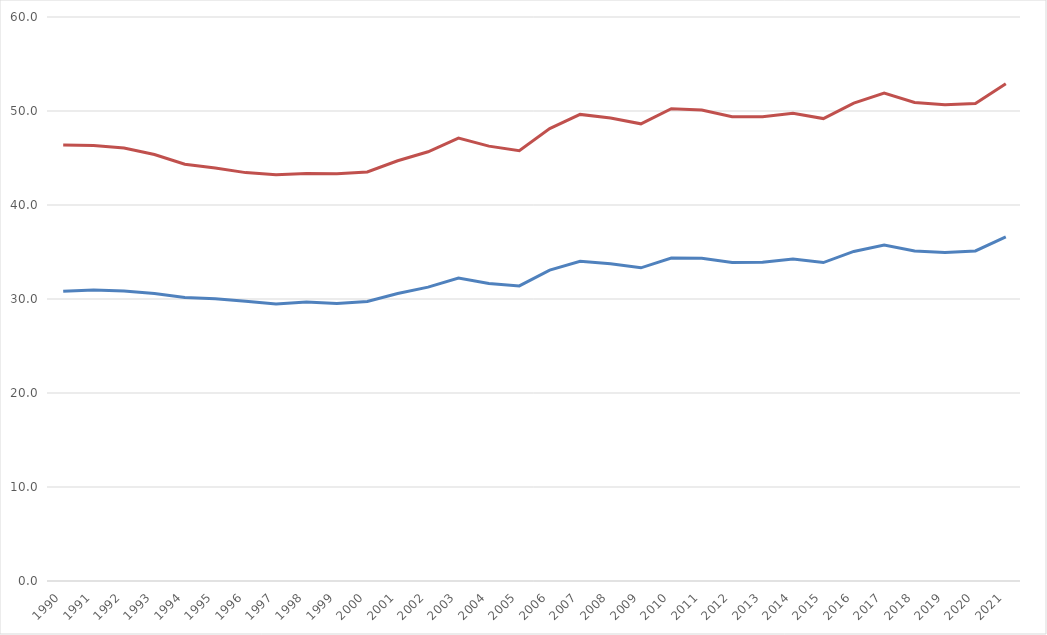
| Category | Gesamtenergieverbrauch/Gesamtfläche (MW) | Gesamtenergieverbrauch/LN Mittelwert |
|---|---|---|
| 1990.0 | 30.827 | 46.39 |
| 1991.0 | 30.966 | 46.337 |
| 1992.0 | 30.856 | 46.055 |
| 1993.0 | 30.574 | 45.377 |
| 1994.0 | 30.154 | 44.338 |
| 1995.0 | 30.038 | 43.935 |
| 1996.0 | 29.748 | 43.446 |
| 1997.0 | 29.465 | 43.231 |
| 1998.0 | 29.678 | 43.348 |
| 1999.0 | 29.508 | 43.33 |
| 2000.0 | 29.742 | 43.515 |
| 2001.0 | 30.58 | 44.703 |
| 2002.0 | 31.259 | 45.658 |
| 2003.0 | 32.238 | 47.112 |
| 2004.0 | 31.646 | 46.261 |
| 2005.0 | 31.392 | 45.773 |
| 2006.0 | 33.077 | 48.132 |
| 2007.0 | 34.021 | 49.637 |
| 2008.0 | 33.76 | 49.261 |
| 2009.0 | 33.318 | 48.635 |
| 2010.0 | 34.353 | 50.239 |
| 2011.0 | 34.332 | 50.111 |
| 2012.0 | 33.874 | 49.389 |
| 2013.0 | 33.901 | 49.392 |
| 2014.0 | 34.252 | 49.751 |
| 2015.0 | 33.874 | 49.191 |
| 2016.0 | 35.057 | 50.846 |
| 2017.0 | 35.75 | 51.902 |
| 2018.0 | 35.1 | 50.914 |
| 2019.0 | 34.952 | 50.667 |
| 2020.0 | 35.117 | 50.797 |
| 2021.0 | 36.618 | 52.904 |